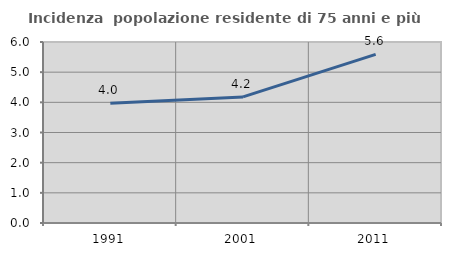
| Category | Incidenza  popolazione residente di 75 anni e più |
|---|---|
| 1991.0 | 3.966 |
| 2001.0 | 4.179 |
| 2011.0 | 5.589 |